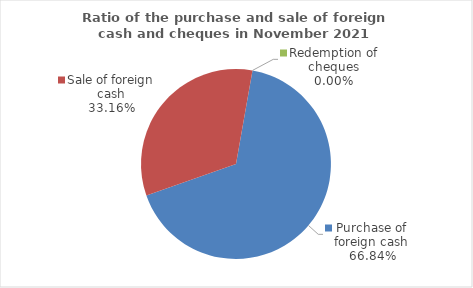
| Category | Series 0 |
|---|---|
| Purchase of foreign cash | 66.838 |
| Sale of foreign cash | 33.162 |
| Redemption of cheques | 0 |